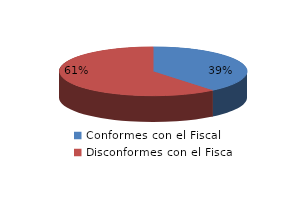
| Category | Series 0 |
|---|---|
| 0 | 25 |
| 1 | 39 |